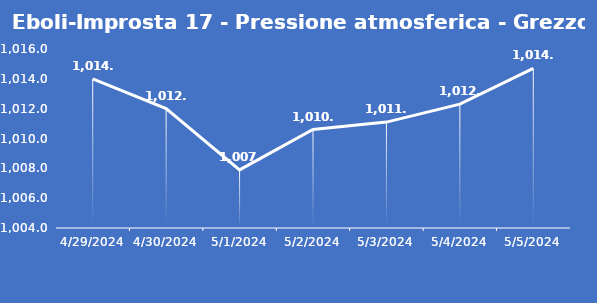
| Category | Eboli-Improsta 17 - Pressione atmosferica - Grezzo (hPa) |
|---|---|
| 4/29/24 | 1014 |
| 4/30/24 | 1012 |
| 5/1/24 | 1007.9 |
| 5/2/24 | 1010.6 |
| 5/3/24 | 1011.1 |
| 5/4/24 | 1012.3 |
| 5/5/24 | 1014.7 |